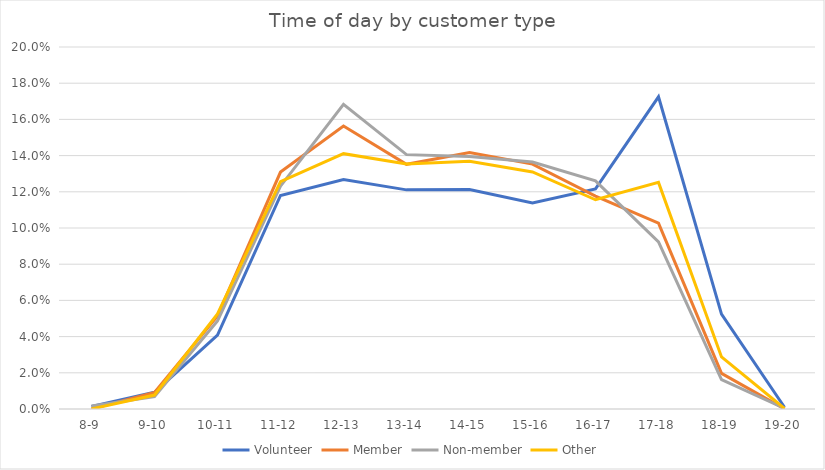
| Category | Volunteer | Member | Non-member | Other |
|---|---|---|---|---|
| 8-9 | 0.001 | 0 | 0.002 | 0 |
| 9-10 | 0.009 | 0.009 | 0.007 | 0.008 |
| 10-11 | 0.041 | 0.051 | 0.049 | 0.053 |
| 11-12 | 0.118 | 0.131 | 0.123 | 0.126 |
| 12-13 | 0.127 | 0.156 | 0.168 | 0.141 |
| 13-14 | 0.121 | 0.135 | 0.141 | 0.135 |
| 14-15 | 0.121 | 0.142 | 0.14 | 0.137 |
| 15-16 | 0.114 | 0.135 | 0.136 | 0.131 |
| 16-17 | 0.122 | 0.118 | 0.126 | 0.116 |
| 17-18 | 0.172 | 0.103 | 0.092 | 0.125 |
| 18-19 | 0.052 | 0.02 | 0.016 | 0.029 |
| 19-20 | 0.001 | 0 | 0 | 0 |